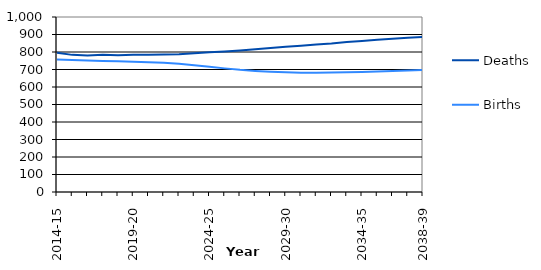
| Category | Deaths | Births |
|---|---|---|
| 2014-15 | 795.659 | 757.655 |
|  | 783.591 | 753.686 |
|  | 779.612 | 751.141 |
|  | 783.795 | 748.257 |
|  | 782.068 | 746.437 |
| 2019-20 | 783.954 | 744.825 |
|  | 783.851 | 741.788 |
|  | 785.585 | 738.732 |
|  | 787.598 | 732.456 |
|  | 793.278 | 724.053 |
| 2024-25 | 798.423 | 715.576 |
|  | 802.616 | 706.405 |
|  | 808.494 | 698.051 |
|  | 815.141 | 691.97 |
|  | 822.274 | 687.161 |
| 2029-30 | 829.448 | 683.664 |
|  | 835.907 | 681.97 |
|  | 842.511 | 681.938 |
|  | 848.498 | 683.302 |
|  | 856.921 | 684.552 |
| 2034-35 | 863.353 | 686.113 |
|  | 870.21 | 688.618 |
|  | 875.237 | 691.829 |
|  | 881.786 | 694.95 |
| 2038-39 | 885.527 | 697.756 |